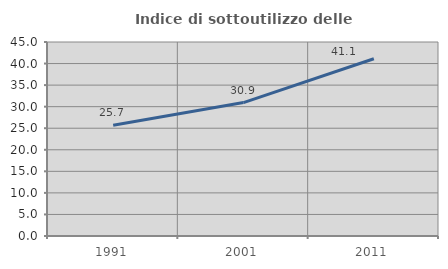
| Category | Indice di sottoutilizzo delle abitazioni  |
|---|---|
| 1991.0 | 25.688 |
| 2001.0 | 30.946 |
| 2011.0 | 41.108 |